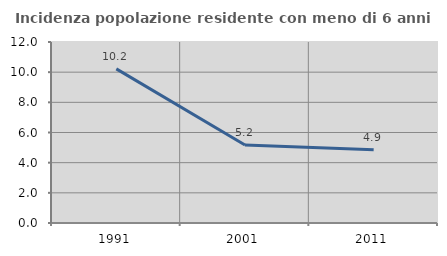
| Category | Incidenza popolazione residente con meno di 6 anni |
|---|---|
| 1991.0 | 10.218 |
| 2001.0 | 5.17 |
| 2011.0 | 4.858 |